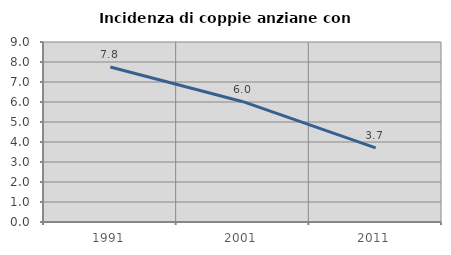
| Category | Incidenza di coppie anziane con figli |
|---|---|
| 1991.0 | 7.752 |
| 2001.0 | 6.015 |
| 2011.0 | 3.704 |